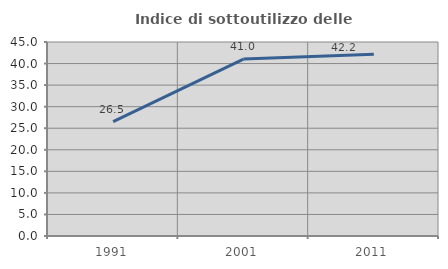
| Category | Indice di sottoutilizzo delle abitazioni  |
|---|---|
| 1991.0 | 26.544 |
| 2001.0 | 41.033 |
| 2011.0 | 42.155 |